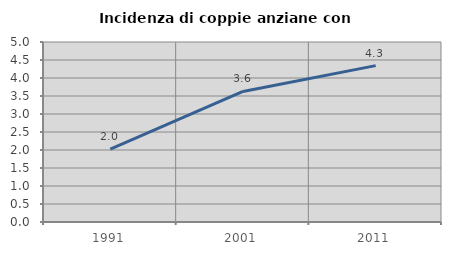
| Category | Incidenza di coppie anziane con figli |
|---|---|
| 1991.0 | 2.023 |
| 2001.0 | 3.627 |
| 2011.0 | 4.343 |